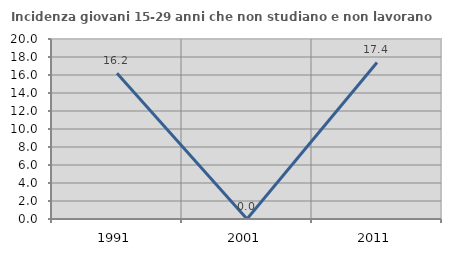
| Category | Incidenza giovani 15-29 anni che non studiano e non lavorano  |
|---|---|
| 1991.0 | 16.201 |
| 2001.0 | 0 |
| 2011.0 | 17.391 |